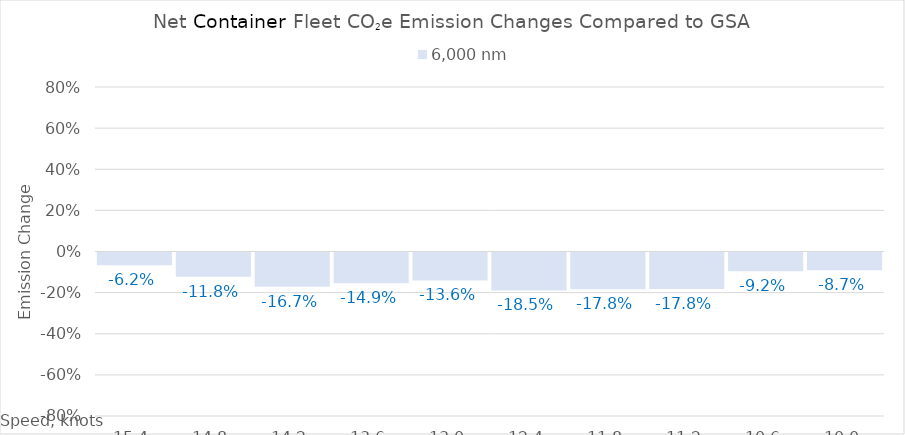
| Category | 6,000 |
|---|---|
| 15.4 | -0.062 |
| 14.8 | -0.118 |
| 14.200000000000001 | -0.167 |
| 13.600000000000001 | -0.149 |
| 13.000000000000002 | -0.136 |
| 12.400000000000002 | -0.185 |
| 11.800000000000002 | -0.178 |
| 11.200000000000003 | -0.178 |
| 10.600000000000003 | -0.092 |
| 10.000000000000004 | -0.087 |